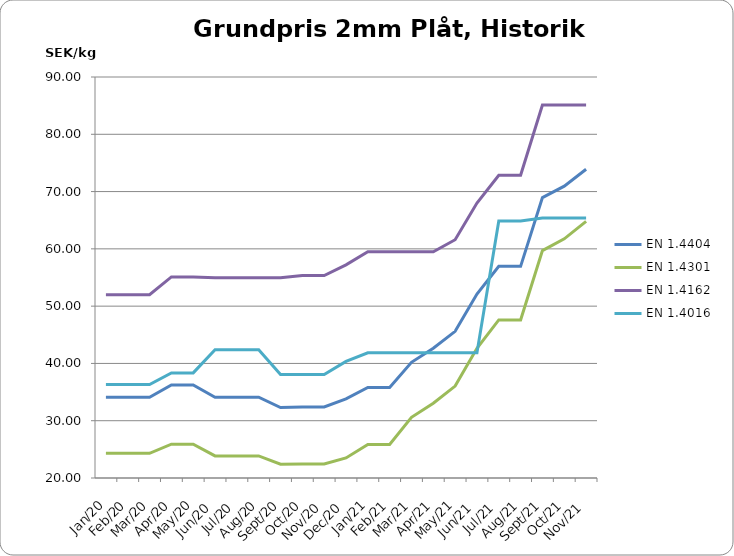
| Category | EN 1.4404 | EN 1.4301 | EN 1.4162  | EN 1.4016 |
|---|---|---|---|---|
| 2020-01-15 | 34.1 | 24.3 | 52 | 36.3 |
| 2020-02-15 | 34.1 | 24.3 | 52 | 36.3 |
| 2020-03-15 | 34.1 | 24.3 | 52 | 36.3 |
| 2020-04-26 | 36.25 | 25.9 | 55.1 | 38.35 |
| 2020-05-26 | 36.25 | 25.9 | 55.1 | 38.35 |
| 2020-06-26 | 34.1 | 23.85 | 54.95 | 42.4 |
| 2020-07-26 | 34.1 | 23.85 | 54.95 | 42.4 |
| 2020-08-26 | 34.1 | 23.85 | 54.95 | 42.4 |
| 2020-09-26 | 32.3 | 22.4 | 54.95 | 38.05 |
| 2020-10-26 | 32.4 | 22.45 | 55.35 | 38.05 |
| 2020-11-26 | 32.4 | 22.45 | 55.35 | 38.05 |
| 2020-12-26 | 33.8 | 23.5 | 57.2 | 40.35 |
| 2021-01-26 | 35.8 | 25.85 | 59.5 | 41.85 |
| 2021-02-26 | 35.8 | 25.85 | 59.5 | 41.85 |
| 2021-03-26 | 40.2 | 30.6 | 59.5 | 41.85 |
| 2021-04-26 | 42.65 | 33.05 | 59.5 | 41.85 |
| 2021-05-26 | 45.6 | 36.05 | 61.6 | 41.85 |
| 2021-06-26 | 52.1 | 42.65 | 68 | 41.85 |
| 2021-07-26 | 56.95 | 47.6 | 72.85 | 64.85 |
| 2021-08-26 | 56.95 | 47.6 | 72.85 | 64.85 |
| 2021-09-26 | 68.95 | 59.7 | 85.1 | 65.4 |
| 2021-10-26 | 70.95 | 61.75 | 85.1 | 65.4 |
| 2021-11-26 | 73.9 | 64.8 | 85.1 | 65.4 |